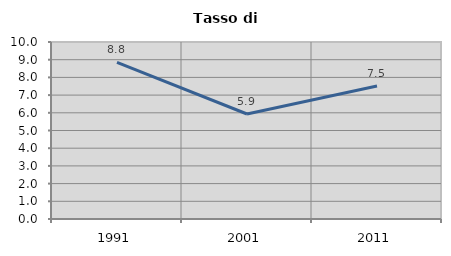
| Category | Tasso di disoccupazione   |
|---|---|
| 1991.0 | 8.843 |
| 2001.0 | 5.932 |
| 2011.0 | 7.517 |